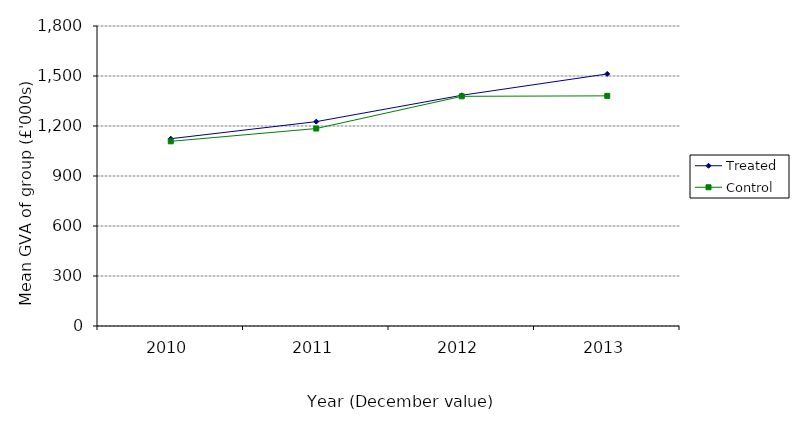
| Category | Treated | Control |
|---|---|---|
| 2010.0 | 1123.719 | 1107.97 |
| 2011.0 | 1226.195 | 1184.845 |
| 2012.0 | 1384.367 | 1378.098 |
| 2013.0 | 1512.35 | 1380.871 |